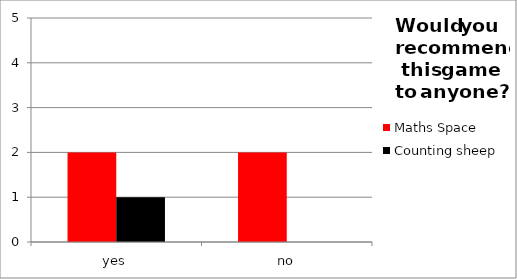
| Category | Maths Space | Counting sheep |
|---|---|---|
| yes | 2 | 1 |
| no | 2 | 0 |